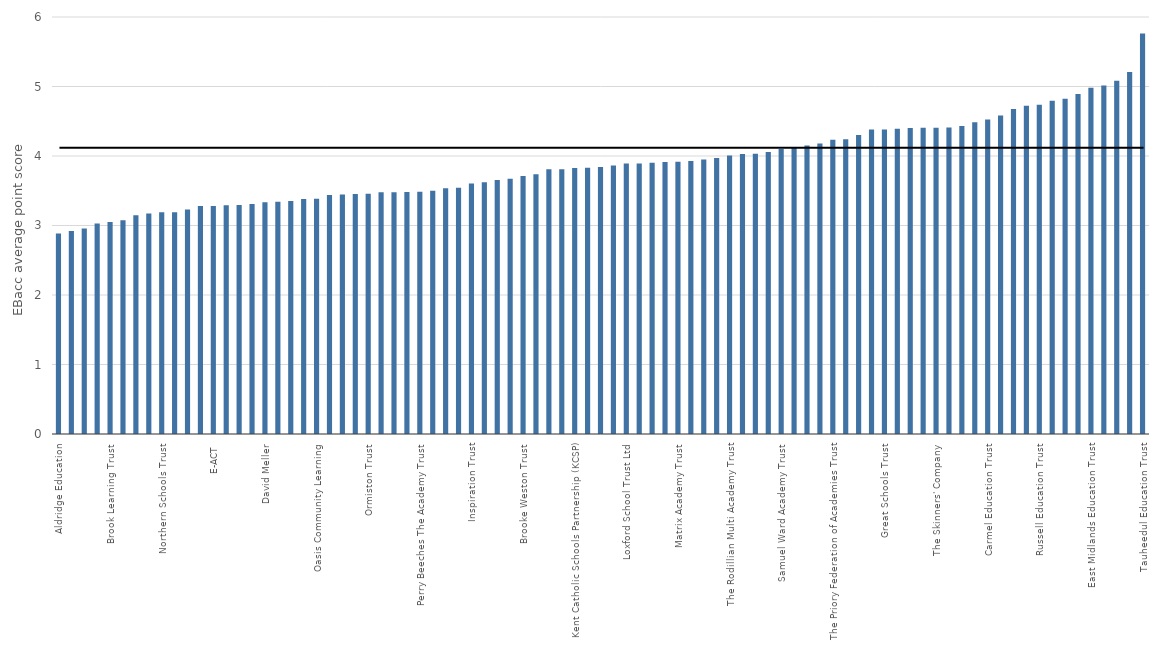
| Category | Series 0 |
|---|---|
| Aldridge Education | 2.884 |
| Wakefield City Academies Trust | 2.922 |
| The Midland Academies Trust | 2.956 |
| UCAT | 3.029 |
| Brook Learning Trust | 3.05 |
| Education Central Multi Academy Trust | 3.077 |
| Fylde Coast Teaching School Ltd | 3.146 |
| Academies Enterprise Trust (AET) | 3.174 |
| Northern Schools Trust | 3.189 |
| The Co-operative Group | 3.191 |
| White Rose Trust | 3.231 |
| Rosedale Hewens Academy Trust | 3.279 |
| E-ACT | 3.28 |
| Swale Academies Trust | 3.292 |
| The Heath Family Trust | 3.294 |
| Greenwood Academies Trust | 3.311 |
| David Meller | 3.335 |
| Eastern Multi-Academy Trust | 3.34 |
| Transforming Education in Norfolk (the TEN Group) | 3.351 |
| Kemnal Academy Trust, The (TKAT) | 3.38 |
| Oasis Community Learning | 3.384 |
| Grace Foundation | 3.438 |
| Northern Education Trust | 3.445 |
| Leigh Academies Trust | 3.453 |
| Ormiston Trust | 3.455 |
| Bright Tribe Trust | 3.479 |
| Academy Transformation Trust (ATT) | 3.479 |
| Diocese of Oxford | 3.483 |
| Perry Beeches The Academy Trust | 3.484 |
| David Ross Education Trust (DRET) | 3.499 |
| Cabot Learning Federation | 3.536 |
| Stoke-on-Trent College | 3.545 |
| Inspiration Trust | 3.605 |
| Creative Education Trust | 3.623 |
| Community Academies Trust (CAT) | 3.654 |
| Woodard Academies Trust | 3.674 |
| Brooke Weston Trust | 3.712 |
| CfBT Education Trust | 3.738 |
| Outwood Grange Academies Trust | 3.808 |
| The Education Fellowship Trust | 3.809 |
| Kent Catholic Schools Partnership (KCSP) | 3.827 |
| The Dean Trust | 3.829 |
| United Learning | 3.841 |
| Diverse Academies Trust | 3.864 |
| Loxford School Trust Ltd | 3.892 |
| Bourne Education Trust | 3.893 |
| Landau Forte Charitable Trust | 3.902 |
| Delta Academies Trust (Delta) | 3.912 |
| Matrix Academy Trust | 3.917 |
| Aspirations Academies Trust (AAT) | 3.93 |
| Invictus Education Trust | 3.95 |
| FPTA Academies (Fort Pitt Grammar School and The Thomas Aveling School) | 3.971 |
| The Rodillian Multi Academy Trust | 4.008 |
| Wellsway School Academy Trust | 4.028 |
| The Redhill Academy Trust | 4.034 |
| ARK Schools | 4.056 |
| Samuel Ward Academy Trust | 4.102 |
| Coastal Academies Trust | 4.127 |
| Tapton School Academy trust | 4.153 |
| Cambridge Meridian Academies Trust (CMAT) | 4.179 |
| The Priory Federation of Academies Trust | 4.234 |
| The Seckford Foundation Free Schools Trust | 4.24 |
| The GORSE Academies Trust | 4.302 |
| The Spencer Academies Trust | 4.381 |
| Great Schools Trust | 4.381 |
| The Castle School Education Trust | 4.392 |
| Guildford Education Partnership | 4.403 |
| The Haberdashers' Livery Company | 4.406 |
| The Skinners' Company | 4.408 |
| The Athelstan Trust | 4.41 |
| The Arthur Terry Learning Partnership | 4.433 |
| The Howard Partnership Trust | 4.486 |
| Carmel Education Trust | 4.526 |
| Harris Federation | 4.582 |
| City of London Academies Trust | 4.676 |
| Tudor Grange Academies Trust | 4.724 |
| Russell Education Trust | 4.738 |
| The Diocese of Westminster Academy Trust | 4.795 |
| Dixons Academy Trust | 4.822 |
| The Cam Academy Trust | 4.892 |
| East Midlands Education Trust | 4.981 |
| The Thinking Schools Academy Trust | 5.015 |
| Bright Futures Educational Trust | 5.084 |
| Diocese of London | 5.207 |
| Tauheedul Education Trust | 5.761 |